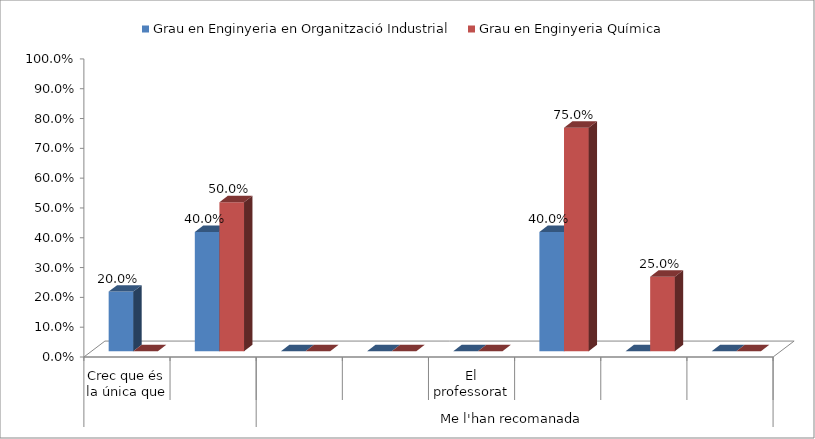
| Category | Grau en Enginyeria en Organització Industrial | Grau en Enginyeria Química |
|---|---|---|
| 0 | 0.2 | 0 |
| 1 | 0.4 | 0.5 |
| 2 | 0 | 0 |
| 3 | 0 | 0 |
| 4 | 0 | 0 |
| 5 | 0.4 | 0.75 |
| 6 | 0 | 0.25 |
| 7 | 0 | 0 |